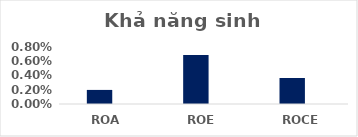
| Category | Series 0 | Series 1 | Series 2 | Series 3 |
|---|---|---|---|---|
| ROA | 0.002 |  |  |  |
| ROE | 0.007 |  |  |  |
| ROCE | 0.004 |  |  |  |